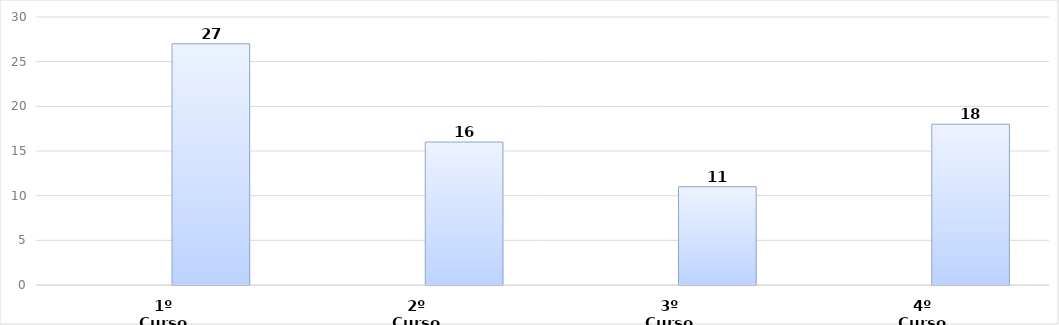
| Category | Series 0 | Series 1 |
|---|---|---|
| 1º Curso |  | 27 |
| 2º Curso |  | 16 |
| 3º Curso |  | 11 |
| 4º Curso |  | 18 |